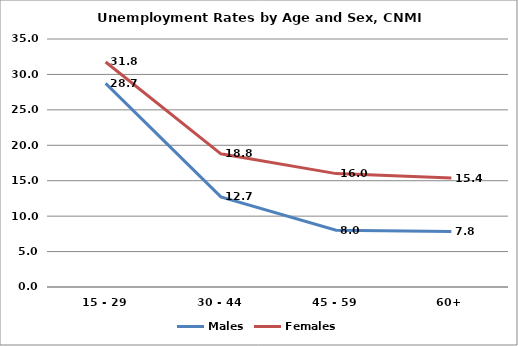
| Category | Males | Females |
|---|---|---|
| 15 - 29 | 28.734 | 31.758 |
| 30 - 44 | 12.726 | 18.793 |
| 45 - 59 | 8.016 | 16.002 |
| 60+ | 7.843 | 15.367 |